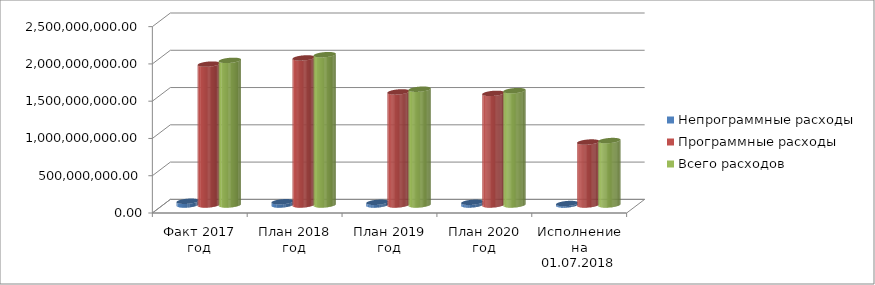
| Category | Непрограммные расходы | Программные расходы | Всего расходов |
|---|---|---|---|
| Факт 2017 год | 50335615.32 | 1889977262.2 | 1940312877.52 |
| План 2018 год | 43536943.65 | 1972759264.15 | 2016296207.8 |
| План 2019 год | 36494820 | 1516957990 | 1553452810 |
| План 2020 год | 36515620 | 1497604780 | 1534120400 |
| Исполнение на 01.07.2018 года | 19827383.94 | 844652574.67 | 864479958.61 |